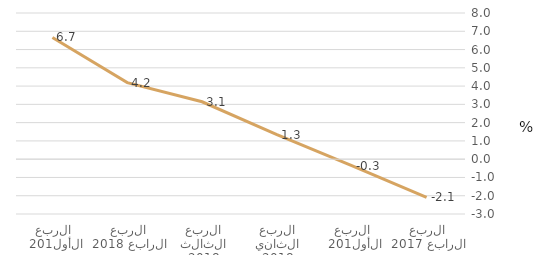
| Category | قطاع الشركات غير المالية |
|---|---|
| الربع الرابع 2017 | -2.089 |
| الربع الأول 2018 | -0.348 |
| الربع الثاني 2018 | 1.343 |
| الربع الثالث 2018 | 3.142 |
| الربع الرابع 2018 | 4.189 |
| الربع الأول 2019 | 6.662 |